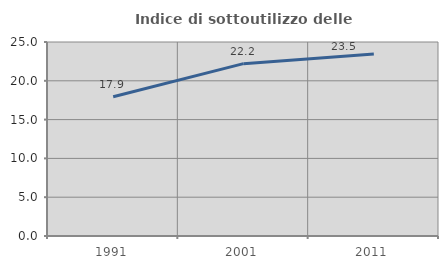
| Category | Indice di sottoutilizzo delle abitazioni  |
|---|---|
| 1991.0 | 17.935 |
| 2001.0 | 22.208 |
| 2011.0 | 23.467 |